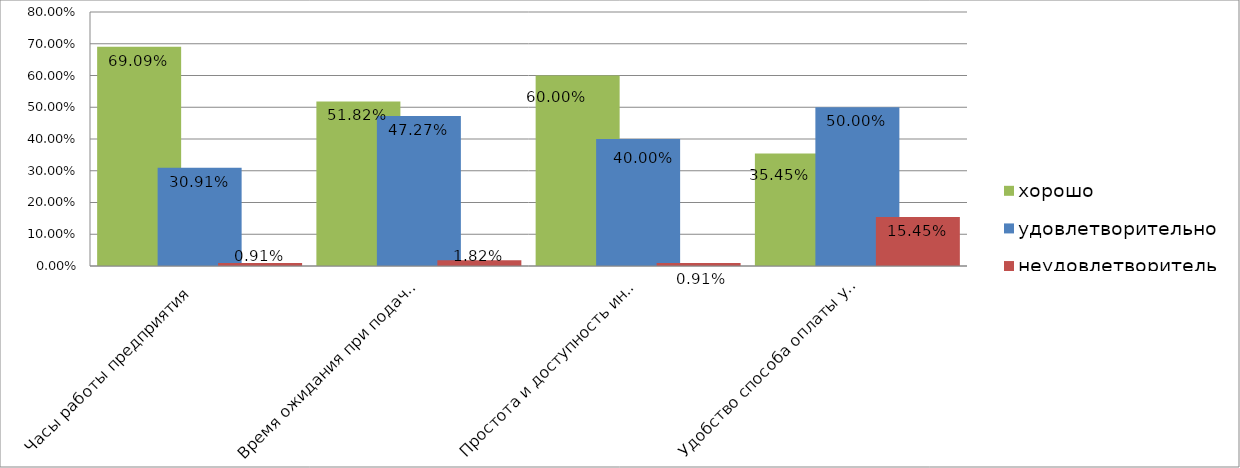
| Category | хорошо | удовлетворительно | неудовлетворительно |
|---|---|---|---|
| Часы работы предприятия  | 0.691 | 0.309 | 0.009 |
| Время ожидания при подаче заявки  | 0.518 | 0.473 | 0.018 |
| Простота и доступность информационно-справочных материалов, необходимых для оформления заявки  | 0.6 | 0.4 | 0.009 |
| Удобство способа оплаты услуг, предоставляемых предприятием  | 0.355 | 0.5 | 0.155 |